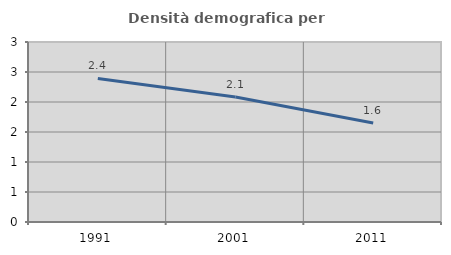
| Category | Densità demografica |
|---|---|
| 1991.0 | 2.392 |
| 2001.0 | 2.084 |
| 2011.0 | 1.649 |